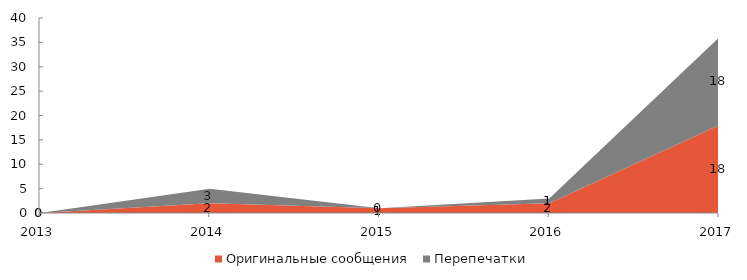
| Category | Оригинальные сообщения | Перепечатки |
|---|---|---|
| 2013 | 0 | 0 |
| 2014 | 2 | 3 |
| 2015 | 1 | 0 |
| 2016 | 2 | 1 |
| 2017 | 18 | 18 |